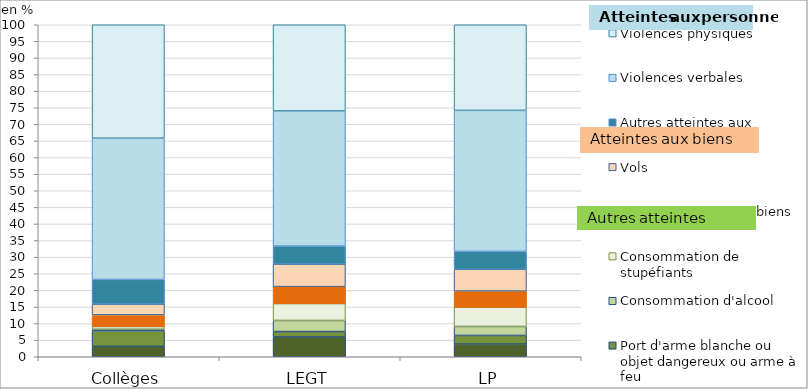
| Category | Autres atteintes à la sécurité | Port d'arme blanche ou objet dangereux ou arme à feu | Consommation d'alcool | Consommation de stupéfiants | Autres atteintes aux biens | Vols | Autres atteintes aux personnes | Violences verbales | Violences physiques  |
|---|---|---|---|---|---|---|---|---|---|
| Collèges | 3.134 | 4.656 | 0.509 | 0.81 | 3.485 | 3.286 | 7.398 | 42.553 | 34.168 |
| LEGT | 5.942 | 1.654 | 3.344 | 5.081 | 5.113 | 6.793 | 5.409 | 40.709 | 25.957 |
| LP | 3.802 | 2.61 | 2.723 | 5.804 | 4.831 | 6.617 | 5.347 | 42.472 | 25.792 |